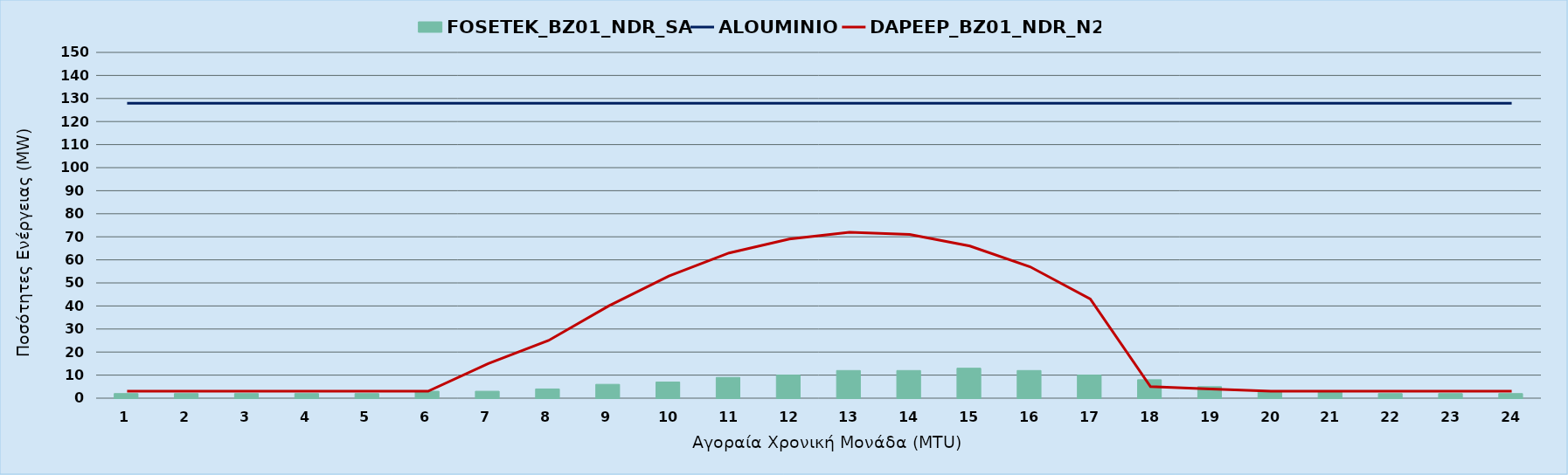
| Category | FOSETEK_BZ01_NDR_SA |
|---|---|
| 0 | 2 |
| 1 | 2 |
| 2 | 2 |
| 3 | 2 |
| 4 | 2 |
| 5 | 3 |
| 6 | 3 |
| 7 | 4 |
| 8 | 6 |
| 9 | 7 |
| 10 | 9 |
| 11 | 10 |
| 12 | 12 |
| 13 | 12 |
| 14 | 13 |
| 15 | 12 |
| 16 | 10 |
| 17 | 8 |
| 18 | 5 |
| 19 | 3 |
| 20 | 3 |
| 21 | 2 |
| 22 | 2 |
| 23 | 2 |